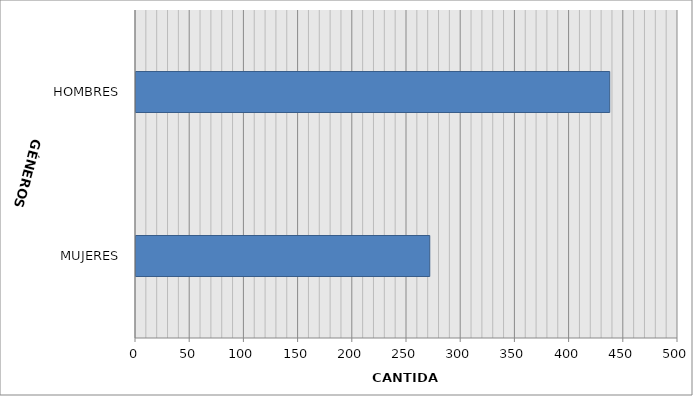
| Category | Series 0 |
|---|---|
| MUJERES | 271 |
| HOMBRES | 437 |